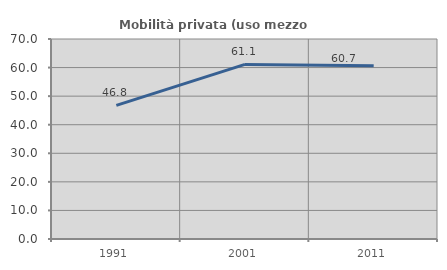
| Category | Mobilità privata (uso mezzo privato) |
|---|---|
| 1991.0 | 46.763 |
| 2001.0 | 61.111 |
| 2011.0 | 60.669 |